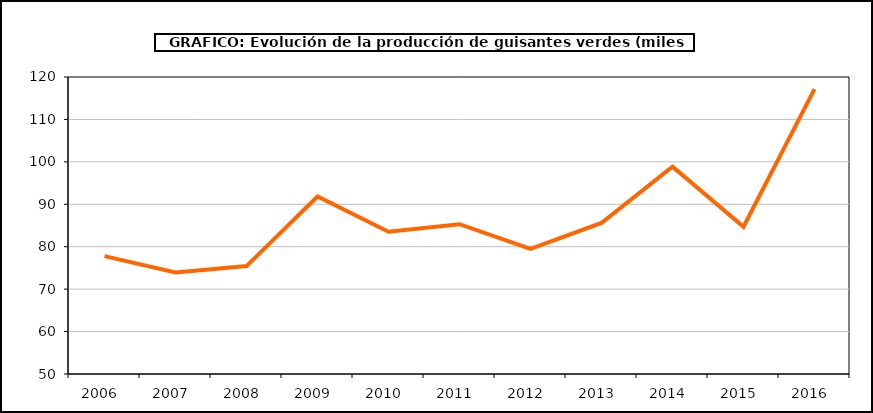
| Category | producción |
|---|---|
| 2006.0 | 77.793 |
| 2007.0 | 73.937 |
| 2008.0 | 75.438 |
| 2009.0 | 91.847 |
| 2010.0 | 83.53 |
| 2011.0 | 85.3 |
| 2012.0 | 79.511 |
| 2013.0 | 85.601 |
| 2014.0 | 98.878 |
| 2015.0 | 84.705 |
| 2016.0 | 117.126 |